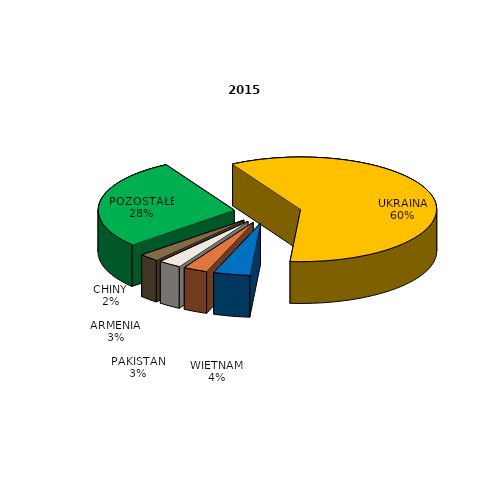
| Category | Series 0 |
|---|---|
| UKRAINA | 1282 |
| WIETNAM | 93 |
| PAKISTAN | 62 |
| ARMENIA | 58 |
| CHINY | 51 |
| POZOSTAŁE | 606 |